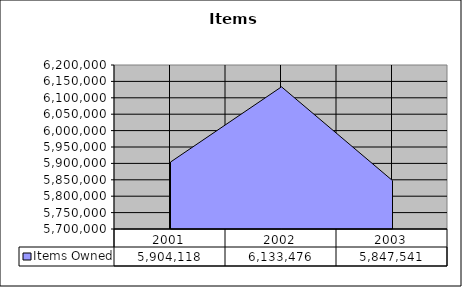
| Category | Items Owned |
|---|---|
| 2001.0 | 5904118 |
| 2002.0 | 6133476 |
| 2003.0 | 5847541 |